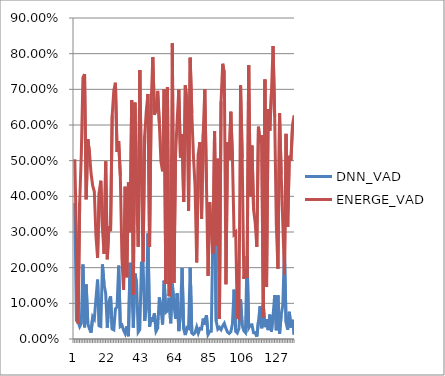
| Category | DNN_VAD | ENERGE_VAD |
|---|---|---|
| 0 | 0.381 | 0.504 |
| 1 | 0.052 | 0.281 |
| 2 | 0.048 | 0.043 |
| 3 | 0.035 | 0.383 |
| 4 | 0.044 | 0.518 |
| 5 | 0.209 | 0.733 |
| 6 | 0.033 | 0.743 |
| 7 | 0.153 | 0.392 |
| 8 | 0.043 | 0.56 |
| 9 | 0.029 | 0.524 |
| 10 | 0.018 | 0.464 |
| 11 | 0.062 | 0.43 |
| 12 | 0.056 | 0.413 |
| 13 | 0.112 | 0.29 |
| 14 | 0.167 | 0.228 |
| 15 | 0.037 | 0.411 |
| 16 | 0.035 | 0.444 |
| 17 | 0.209 | 0.311 |
| 18 | 0.152 | 0.239 |
| 19 | 0.128 | 0.498 |
| 20 | 0.032 | 0.224 |
| 21 | 0.105 | 0.317 |
| 22 | 0.119 | 0.302 |
| 23 | 0.028 | 0.627 |
| 24 | 0.026 | 0.697 |
| 25 | 0.084 | 0.718 |
| 26 | 0.09 | 0.524 |
| 27 | 0.206 | 0.555 |
| 28 | 0.035 | 0.458 |
| 29 | 0.039 | 0.228 |
| 30 | 0.025 | 0.138 |
| 31 | 0.015 | 0.427 |
| 32 | 0.036 | 0.173 |
| 33 | 0.008 | 0.439 |
| 34 | 0.214 | 0.299 |
| 35 | 0.15 | 0.67 |
| 36 | 0.032 | 0.124 |
| 37 | 0.183 | 0.663 |
| 38 | 0.158 | 0.408 |
| 39 | 0.019 | 0.259 |
| 40 | 0.027 | 0.754 |
| 41 | 0.213 | 0.452 |
| 42 | 0.214 | 0.216 |
| 43 | 0.051 | 0.57 |
| 44 | 0.09 | 0.64 |
| 45 | 0.296 | 0.687 |
| 46 | 0.034 | 0.258 |
| 47 | 0.061 | 0.661 |
| 48 | 0.048 | 0.79 |
| 49 | 0.072 | 0.629 |
| 50 | 0.022 | 0.643 |
| 51 | 0.03 | 0.696 |
| 52 | 0.117 | 0.606 |
| 53 | 0.088 | 0.498 |
| 54 | 0.041 | 0.47 |
| 55 | 0.164 | 0.7 |
| 56 | 0.075 | 0.154 |
| 57 | 0.079 | 0.706 |
| 58 | 0.116 | 0.12 |
| 59 | 0.044 | 0.156 |
| 60 | 0.155 | 0.829 |
| 61 | 0.098 | 0.157 |
| 62 | 0.057 | 0.518 |
| 63 | 0.128 | 0.613 |
| 64 | 0.022 | 0.699 |
| 65 | 0.069 | 0.509 |
| 66 | 0.199 | 0.574 |
| 67 | 0.029 | 0.384 |
| 68 | 0.011 | 0.711 |
| 69 | 0.032 | 0.664 |
| 70 | 0.03 | 0.359 |
| 71 | 0.2 | 0.789 |
| 72 | 0.017 | 0.633 |
| 73 | 0.013 | 0.513 |
| 74 | 0.018 | 0.428 |
| 75 | 0.033 | 0.215 |
| 76 | 0.017 | 0.52 |
| 77 | 0.03 | 0.552 |
| 78 | 0.028 | 0.336 |
| 79 | 0.057 | 0.574 |
| 80 | 0.041 | 0.7 |
| 81 | 0.067 | 0.438 |
| 82 | 0.013 | 0.177 |
| 83 | 0.021 | 0.383 |
| 84 | 0.022 | 0.304 |
| 85 | 0.311 | 0.24 |
| 86 | 0.381 | 0.583 |
| 87 | 0.05 | 0.261 |
| 88 | 0.028 | 0.505 |
| 89 | 0.033 | 0.056 |
| 90 | 0.026 | 0.666 |
| 91 | 0.037 | 0.772 |
| 92 | 0.044 | 0.746 |
| 93 | 0.03 | 0.154 |
| 94 | 0.02 | 0.552 |
| 95 | 0.016 | 0.502 |
| 96 | 0.02 | 0.637 |
| 97 | 0.042 | 0.51 |
| 98 | 0.138 | 0.294 |
| 99 | 0.021 | 0.299 |
| 100 | 0.017 | 0.061 |
| 101 | 0.03 | 0.057 |
| 102 | 0.111 | 0.711 |
| 103 | 0.039 | 0.508 |
| 104 | 0.023 | 0.168 |
| 105 | 0.018 | 0.196 |
| 106 | 0.232 | 0.171 |
| 107 | 0.031 | 0.768 |
| 108 | 0.039 | 0.4 |
| 109 | 0.04 | 0.542 |
| 110 | 0.017 | 0.363 |
| 111 | 0.018 | 0.327 |
| 112 | 0.007 | 0.258 |
| 113 | 0.049 | 0.595 |
| 114 | 0.092 | 0.549 |
| 115 | 0.03 | 0.571 |
| 116 | 0.096 | 0.061 |
| 117 | 0.033 | 0.728 |
| 118 | 0.056 | 0.146 |
| 119 | 0.025 | 0.645 |
| 120 | 0.068 | 0.584 |
| 121 | 0.021 | 0.689 |
| 122 | 0.065 | 0.822 |
| 123 | 0.123 | 0.623 |
| 124 | 0.025 | 0.32 |
| 125 | 0.122 | 0.197 |
| 126 | 0.015 | 0.633 |
| 127 | 0.067 | 0.461 |
| 128 | 0.096 | 0.323 |
| 129 | 0.245 | 0.181 |
| 130 | 0.047 | 0.575 |
| 131 | 0.026 | 0.314 |
| 132 | 0.076 | 0.514 |
| 133 | 0.032 | 0.5 |
| 134 | 0.054 | 0.601 |
| 135 | 0.012 | 0.627 |